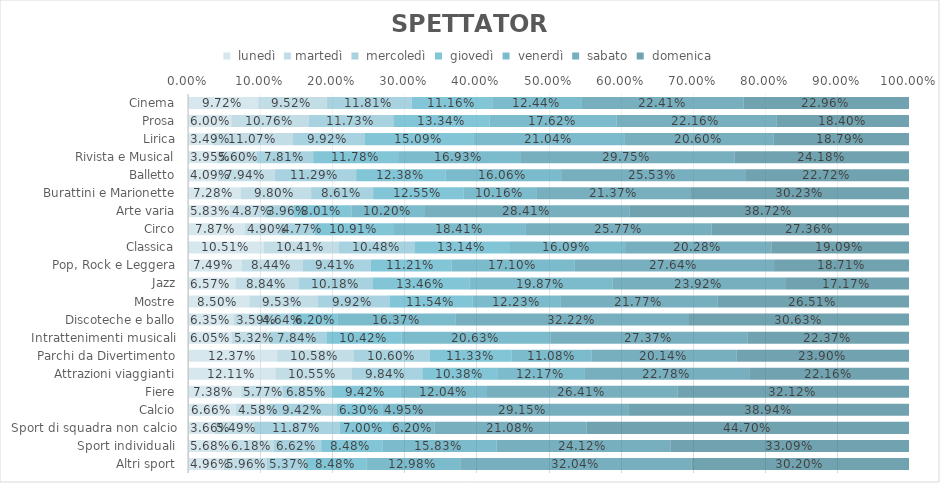
| Category |  lunedì | martedì |  mercoledì |  giovedì |  venerdì |  sabato |  domenica |
|---|---|---|---|---|---|---|---|
| Cinema | 0.097 | 0.095 | 0.118 | 0.112 | 0.124 | 0.224 | 0.23 |
| Prosa | 0.06 | 0.108 | 0.117 | 0.133 | 0.176 | 0.222 | 0.184 |
| Lirica | 0.035 | 0.111 | 0.099 | 0.151 | 0.21 | 0.206 | 0.188 |
| Rivista e Musical | 0.04 | 0.056 | 0.078 | 0.118 | 0.169 | 0.298 | 0.242 |
| Balletto | 0.041 | 0.079 | 0.113 | 0.124 | 0.161 | 0.255 | 0.227 |
| Burattini e Marionette | 0.073 | 0.098 | 0.086 | 0.126 | 0.102 | 0.214 | 0.302 |
| Arte varia | 0.058 | 0.049 | 0.04 | 0.08 | 0.102 | 0.284 | 0.387 |
| Circo | 0.079 | 0.049 | 0.048 | 0.109 | 0.184 | 0.258 | 0.274 |
| Classica | 0.105 | 0.104 | 0.105 | 0.131 | 0.161 | 0.203 | 0.191 |
| Pop, Rock e Leggera | 0.075 | 0.084 | 0.094 | 0.112 | 0.171 | 0.276 | 0.187 |
| Jazz | 0.066 | 0.088 | 0.102 | 0.135 | 0.199 | 0.239 | 0.172 |
| Mostre | 0.085 | 0.095 | 0.099 | 0.115 | 0.122 | 0.218 | 0.265 |
| Discoteche e ballo | 0.064 | 0.036 | 0.046 | 0.062 | 0.164 | 0.322 | 0.306 |
| Intrattenimenti musicali | 0.06 | 0.053 | 0.078 | 0.104 | 0.206 | 0.274 | 0.224 |
| Parchi da Divertimento | 0.124 | 0.106 | 0.106 | 0.113 | 0.111 | 0.201 | 0.239 |
| Attrazioni viaggianti | 0.121 | 0.106 | 0.098 | 0.104 | 0.122 | 0.228 | 0.222 |
| Fiere | 0.074 | 0.058 | 0.069 | 0.094 | 0.12 | 0.264 | 0.321 |
| Calcio | 0.067 | 0.046 | 0.094 | 0.063 | 0.05 | 0.292 | 0.389 |
| Sport di squadra non calcio | 0.037 | 0.055 | 0.119 | 0.07 | 0.062 | 0.211 | 0.447 |
| Sport individuali | 0.057 | 0.062 | 0.066 | 0.085 | 0.158 | 0.241 | 0.331 |
| Altri sport | 0.05 | 0.06 | 0.054 | 0.085 | 0.13 | 0.32 | 0.302 |